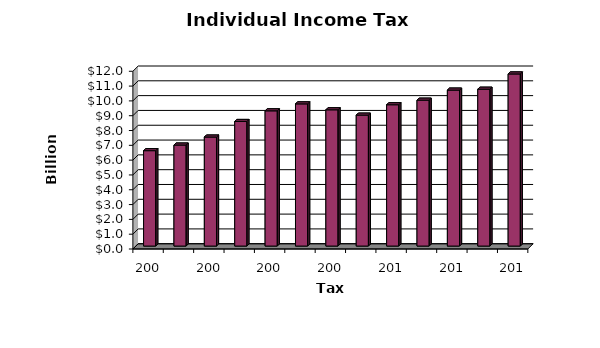
| Category | Series 0 |
|---|---|
| 2002.0 | 6.44 |
| 2003.0 | 6.82 |
| 2004.0 | 7.36 |
| 2005.0 | 8.41 |
| 2006.0 | 9.13 |
| 2007.0 | 9.6 |
| 2008.0 | 9.2 |
| 2009.0 | 8.84 |
| 2010.0 | 9.54 |
| 2011.0 | 9.85 |
| 2012.0 | 10.53 |
| 2013.0 | 10.59 |
| 2014.0 | 11.62 |